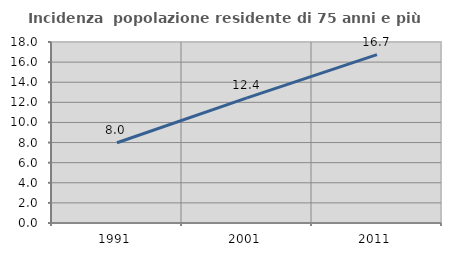
| Category | Incidenza  popolazione residente di 75 anni e più |
|---|---|
| 1991.0 | 7.979 |
| 2001.0 | 12.44 |
| 2011.0 | 16.749 |